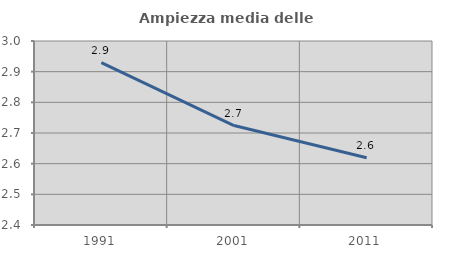
| Category | Ampiezza media delle famiglie |
|---|---|
| 1991.0 | 2.929 |
| 2001.0 | 2.724 |
| 2011.0 | 2.62 |